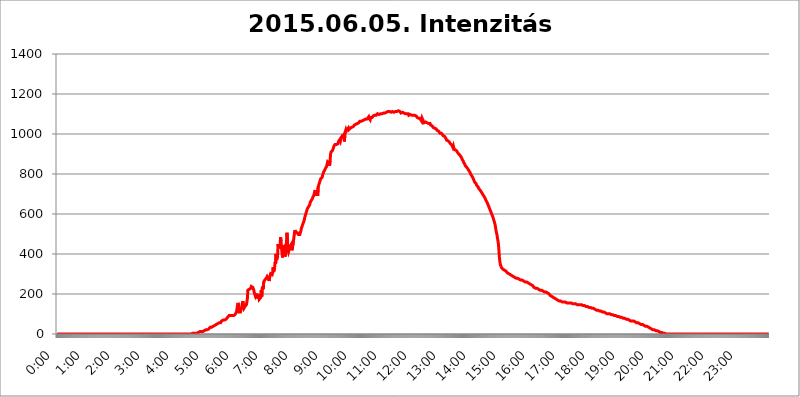
| Category | 2015.06.05. Intenzitás [W/m^2] |
|---|---|
| 0.0 | 0 |
| 0.0006944444444444445 | 0 |
| 0.001388888888888889 | 0 |
| 0.0020833333333333333 | 0 |
| 0.002777777777777778 | 0 |
| 0.003472222222222222 | 0 |
| 0.004166666666666667 | 0 |
| 0.004861111111111111 | 0 |
| 0.005555555555555556 | 0 |
| 0.0062499999999999995 | 0 |
| 0.006944444444444444 | 0 |
| 0.007638888888888889 | 0 |
| 0.008333333333333333 | 0 |
| 0.009027777777777779 | 0 |
| 0.009722222222222222 | 0 |
| 0.010416666666666666 | 0 |
| 0.011111111111111112 | 0 |
| 0.011805555555555555 | 0 |
| 0.012499999999999999 | 0 |
| 0.013194444444444444 | 0 |
| 0.013888888888888888 | 0 |
| 0.014583333333333332 | 0 |
| 0.015277777777777777 | 0 |
| 0.015972222222222224 | 0 |
| 0.016666666666666666 | 0 |
| 0.017361111111111112 | 0 |
| 0.018055555555555557 | 0 |
| 0.01875 | 0 |
| 0.019444444444444445 | 0 |
| 0.02013888888888889 | 0 |
| 0.020833333333333332 | 0 |
| 0.02152777777777778 | 0 |
| 0.022222222222222223 | 0 |
| 0.02291666666666667 | 0 |
| 0.02361111111111111 | 0 |
| 0.024305555555555556 | 0 |
| 0.024999999999999998 | 0 |
| 0.025694444444444447 | 0 |
| 0.02638888888888889 | 0 |
| 0.027083333333333334 | 0 |
| 0.027777777777777776 | 0 |
| 0.02847222222222222 | 0 |
| 0.029166666666666664 | 0 |
| 0.029861111111111113 | 0 |
| 0.030555555555555555 | 0 |
| 0.03125 | 0 |
| 0.03194444444444445 | 0 |
| 0.03263888888888889 | 0 |
| 0.03333333333333333 | 0 |
| 0.034027777777777775 | 0 |
| 0.034722222222222224 | 0 |
| 0.035416666666666666 | 0 |
| 0.036111111111111115 | 0 |
| 0.03680555555555556 | 0 |
| 0.0375 | 0 |
| 0.03819444444444444 | 0 |
| 0.03888888888888889 | 0 |
| 0.03958333333333333 | 0 |
| 0.04027777777777778 | 0 |
| 0.04097222222222222 | 0 |
| 0.041666666666666664 | 0 |
| 0.042361111111111106 | 0 |
| 0.04305555555555556 | 0 |
| 0.043750000000000004 | 0 |
| 0.044444444444444446 | 0 |
| 0.04513888888888889 | 0 |
| 0.04583333333333334 | 0 |
| 0.04652777777777778 | 0 |
| 0.04722222222222222 | 0 |
| 0.04791666666666666 | 0 |
| 0.04861111111111111 | 0 |
| 0.049305555555555554 | 0 |
| 0.049999999999999996 | 0 |
| 0.05069444444444445 | 0 |
| 0.051388888888888894 | 0 |
| 0.052083333333333336 | 0 |
| 0.05277777777777778 | 0 |
| 0.05347222222222222 | 0 |
| 0.05416666666666667 | 0 |
| 0.05486111111111111 | 0 |
| 0.05555555555555555 | 0 |
| 0.05625 | 0 |
| 0.05694444444444444 | 0 |
| 0.057638888888888885 | 0 |
| 0.05833333333333333 | 0 |
| 0.05902777777777778 | 0 |
| 0.059722222222222225 | 0 |
| 0.06041666666666667 | 0 |
| 0.061111111111111116 | 0 |
| 0.06180555555555556 | 0 |
| 0.0625 | 0 |
| 0.06319444444444444 | 0 |
| 0.06388888888888888 | 0 |
| 0.06458333333333334 | 0 |
| 0.06527777777777778 | 0 |
| 0.06597222222222222 | 0 |
| 0.06666666666666667 | 0 |
| 0.06736111111111111 | 0 |
| 0.06805555555555555 | 0 |
| 0.06874999999999999 | 0 |
| 0.06944444444444443 | 0 |
| 0.07013888888888889 | 0 |
| 0.07083333333333333 | 0 |
| 0.07152777777777779 | 0 |
| 0.07222222222222223 | 0 |
| 0.07291666666666667 | 0 |
| 0.07361111111111111 | 0 |
| 0.07430555555555556 | 0 |
| 0.075 | 0 |
| 0.07569444444444444 | 0 |
| 0.0763888888888889 | 0 |
| 0.07708333333333334 | 0 |
| 0.07777777777777778 | 0 |
| 0.07847222222222222 | 0 |
| 0.07916666666666666 | 0 |
| 0.0798611111111111 | 0 |
| 0.08055555555555556 | 0 |
| 0.08125 | 0 |
| 0.08194444444444444 | 0 |
| 0.08263888888888889 | 0 |
| 0.08333333333333333 | 0 |
| 0.08402777777777777 | 0 |
| 0.08472222222222221 | 0 |
| 0.08541666666666665 | 0 |
| 0.08611111111111112 | 0 |
| 0.08680555555555557 | 0 |
| 0.08750000000000001 | 0 |
| 0.08819444444444445 | 0 |
| 0.08888888888888889 | 0 |
| 0.08958333333333333 | 0 |
| 0.09027777777777778 | 0 |
| 0.09097222222222222 | 0 |
| 0.09166666666666667 | 0 |
| 0.09236111111111112 | 0 |
| 0.09305555555555556 | 0 |
| 0.09375 | 0 |
| 0.09444444444444444 | 0 |
| 0.09513888888888888 | 0 |
| 0.09583333333333333 | 0 |
| 0.09652777777777777 | 0 |
| 0.09722222222222222 | 0 |
| 0.09791666666666667 | 0 |
| 0.09861111111111111 | 0 |
| 0.09930555555555555 | 0 |
| 0.09999999999999999 | 0 |
| 0.10069444444444443 | 0 |
| 0.1013888888888889 | 0 |
| 0.10208333333333335 | 0 |
| 0.10277777777777779 | 0 |
| 0.10347222222222223 | 0 |
| 0.10416666666666667 | 0 |
| 0.10486111111111111 | 0 |
| 0.10555555555555556 | 0 |
| 0.10625 | 0 |
| 0.10694444444444444 | 0 |
| 0.1076388888888889 | 0 |
| 0.10833333333333334 | 0 |
| 0.10902777777777778 | 0 |
| 0.10972222222222222 | 0 |
| 0.1111111111111111 | 0 |
| 0.11180555555555556 | 0 |
| 0.11180555555555556 | 0 |
| 0.1125 | 0 |
| 0.11319444444444444 | 0 |
| 0.11388888888888889 | 0 |
| 0.11458333333333333 | 0 |
| 0.11527777777777777 | 0 |
| 0.11597222222222221 | 0 |
| 0.11666666666666665 | 0 |
| 0.1173611111111111 | 0 |
| 0.11805555555555557 | 0 |
| 0.11944444444444445 | 0 |
| 0.12013888888888889 | 0 |
| 0.12083333333333333 | 0 |
| 0.12152777777777778 | 0 |
| 0.12222222222222223 | 0 |
| 0.12291666666666667 | 0 |
| 0.12291666666666667 | 0 |
| 0.12361111111111112 | 0 |
| 0.12430555555555556 | 0 |
| 0.125 | 0 |
| 0.12569444444444444 | 0 |
| 0.12638888888888888 | 0 |
| 0.12708333333333333 | 0 |
| 0.16875 | 0 |
| 0.12847222222222224 | 0 |
| 0.12916666666666668 | 0 |
| 0.12986111111111112 | 0 |
| 0.13055555555555556 | 0 |
| 0.13125 | 0 |
| 0.13194444444444445 | 0 |
| 0.1326388888888889 | 0 |
| 0.13333333333333333 | 0 |
| 0.13402777777777777 | 0 |
| 0.13402777777777777 | 0 |
| 0.13472222222222222 | 0 |
| 0.13541666666666666 | 0 |
| 0.1361111111111111 | 0 |
| 0.13749999999999998 | 0 |
| 0.13819444444444443 | 0 |
| 0.1388888888888889 | 0 |
| 0.13958333333333334 | 0 |
| 0.14027777777777778 | 0 |
| 0.14097222222222222 | 0 |
| 0.14166666666666666 | 0 |
| 0.1423611111111111 | 0 |
| 0.14305555555555557 | 0 |
| 0.14375000000000002 | 0 |
| 0.14444444444444446 | 0 |
| 0.1451388888888889 | 0 |
| 0.1451388888888889 | 0 |
| 0.14652777777777778 | 0 |
| 0.14722222222222223 | 0 |
| 0.14791666666666667 | 0 |
| 0.1486111111111111 | 0 |
| 0.14930555555555555 | 0 |
| 0.15 | 0 |
| 0.15069444444444444 | 0 |
| 0.15138888888888888 | 0 |
| 0.15208333333333332 | 0 |
| 0.15277777777777776 | 0 |
| 0.15347222222222223 | 0 |
| 0.15416666666666667 | 0 |
| 0.15486111111111112 | 0 |
| 0.15555555555555556 | 0 |
| 0.15625 | 0 |
| 0.15694444444444444 | 0 |
| 0.15763888888888888 | 0 |
| 0.15833333333333333 | 0 |
| 0.15902777777777777 | 0 |
| 0.15972222222222224 | 0 |
| 0.16041666666666668 | 0 |
| 0.16111111111111112 | 0 |
| 0.16180555555555556 | 0 |
| 0.1625 | 0 |
| 0.16319444444444445 | 0 |
| 0.1638888888888889 | 0 |
| 0.16458333333333333 | 0 |
| 0.16527777777777777 | 0 |
| 0.16597222222222222 | 0 |
| 0.16666666666666666 | 0 |
| 0.1673611111111111 | 0 |
| 0.16805555555555554 | 0 |
| 0.16874999999999998 | 0 |
| 0.16944444444444443 | 0 |
| 0.17013888888888887 | 0 |
| 0.1708333333333333 | 0 |
| 0.17152777777777775 | 0 |
| 0.17222222222222225 | 0 |
| 0.1729166666666667 | 0 |
| 0.17361111111111113 | 0 |
| 0.17430555555555557 | 0 |
| 0.17500000000000002 | 0 |
| 0.17569444444444446 | 0 |
| 0.1763888888888889 | 0 |
| 0.17708333333333334 | 0 |
| 0.17777777777777778 | 0 |
| 0.17847222222222223 | 0 |
| 0.17916666666666667 | 0 |
| 0.1798611111111111 | 0 |
| 0.18055555555555555 | 0 |
| 0.18125 | 0 |
| 0.18194444444444444 | 0 |
| 0.1826388888888889 | 0 |
| 0.18333333333333335 | 0 |
| 0.1840277777777778 | 0 |
| 0.18472222222222223 | 0 |
| 0.18541666666666667 | 0 |
| 0.18611111111111112 | 0 |
| 0.18680555555555556 | 0 |
| 0.1875 | 0 |
| 0.18819444444444444 | 0 |
| 0.18888888888888888 | 3.525 |
| 0.18958333333333333 | 3.525 |
| 0.19027777777777777 | 3.525 |
| 0.1909722222222222 | 3.525 |
| 0.19166666666666665 | 3.525 |
| 0.19236111111111112 | 3.525 |
| 0.19305555555555554 | 3.525 |
| 0.19375 | 3.525 |
| 0.19444444444444445 | 3.525 |
| 0.1951388888888889 | 3.525 |
| 0.19583333333333333 | 3.525 |
| 0.19652777777777777 | 7.887 |
| 0.19722222222222222 | 7.887 |
| 0.19791666666666666 | 7.887 |
| 0.1986111111111111 | 7.887 |
| 0.19930555555555554 | 7.887 |
| 0.19999999999999998 | 12.257 |
| 0.20069444444444443 | 12.257 |
| 0.20138888888888887 | 12.257 |
| 0.2020833333333333 | 12.257 |
| 0.2027777777777778 | 12.257 |
| 0.2034722222222222 | 12.257 |
| 0.2041666666666667 | 12.257 |
| 0.20486111111111113 | 16.636 |
| 0.20555555555555557 | 16.636 |
| 0.20625000000000002 | 16.636 |
| 0.20694444444444446 | 16.636 |
| 0.2076388888888889 | 21.024 |
| 0.20833333333333334 | 21.024 |
| 0.20902777777777778 | 21.024 |
| 0.20972222222222223 | 21.024 |
| 0.21041666666666667 | 21.024 |
| 0.2111111111111111 | 25.419 |
| 0.21180555555555555 | 25.419 |
| 0.2125 | 25.419 |
| 0.21319444444444444 | 29.823 |
| 0.2138888888888889 | 29.823 |
| 0.21458333333333335 | 34.234 |
| 0.2152777777777778 | 34.234 |
| 0.21597222222222223 | 34.234 |
| 0.21666666666666667 | 34.234 |
| 0.21736111111111112 | 34.234 |
| 0.21805555555555556 | 38.653 |
| 0.21875 | 38.653 |
| 0.21944444444444444 | 38.653 |
| 0.22013888888888888 | 43.079 |
| 0.22083333333333333 | 43.079 |
| 0.22152777777777777 | 43.079 |
| 0.2222222222222222 | 47.511 |
| 0.22291666666666665 | 47.511 |
| 0.2236111111111111 | 47.511 |
| 0.22430555555555556 | 47.511 |
| 0.225 | 51.951 |
| 0.22569444444444445 | 51.951 |
| 0.2263888888888889 | 51.951 |
| 0.22708333333333333 | 56.398 |
| 0.22777777777777777 | 56.398 |
| 0.22847222222222222 | 56.398 |
| 0.22916666666666666 | 56.398 |
| 0.2298611111111111 | 60.85 |
| 0.23055555555555554 | 65.31 |
| 0.23124999999999998 | 65.31 |
| 0.23194444444444443 | 65.31 |
| 0.23263888888888887 | 69.775 |
| 0.2333333333333333 | 69.775 |
| 0.2340277777777778 | 69.775 |
| 0.2347222222222222 | 69.775 |
| 0.2354166666666667 | 69.775 |
| 0.23611111111111113 | 69.775 |
| 0.23680555555555557 | 74.246 |
| 0.23750000000000002 | 74.246 |
| 0.23819444444444446 | 78.722 |
| 0.2388888888888889 | 83.205 |
| 0.23958333333333334 | 83.205 |
| 0.24027777777777778 | 87.692 |
| 0.24097222222222223 | 92.184 |
| 0.24166666666666667 | 92.184 |
| 0.2423611111111111 | 92.184 |
| 0.24305555555555555 | 92.184 |
| 0.24375 | 92.184 |
| 0.24444444444444446 | 92.184 |
| 0.24513888888888888 | 92.184 |
| 0.24583333333333335 | 92.184 |
| 0.2465277777777778 | 92.184 |
| 0.24722222222222223 | 92.184 |
| 0.24791666666666667 | 92.184 |
| 0.24861111111111112 | 96.682 |
| 0.24930555555555556 | 96.682 |
| 0.25 | 101.184 |
| 0.25069444444444444 | 101.184 |
| 0.2513888888888889 | 110.201 |
| 0.2520833333333333 | 114.716 |
| 0.25277777777777777 | 141.884 |
| 0.2534722222222222 | 155.509 |
| 0.25416666666666665 | 146.423 |
| 0.2548611111111111 | 110.201 |
| 0.2555555555555556 | 110.201 |
| 0.25625000000000003 | 110.201 |
| 0.2569444444444445 | 110.201 |
| 0.2576388888888889 | 119.235 |
| 0.25833333333333336 | 128.284 |
| 0.2590277777777778 | 141.884 |
| 0.25972222222222224 | 155.509 |
| 0.2604166666666667 | 164.605 |
| 0.2611111111111111 | 137.347 |
| 0.26180555555555557 | 128.284 |
| 0.2625 | 132.814 |
| 0.26319444444444445 | 137.347 |
| 0.2638888888888889 | 137.347 |
| 0.26458333333333334 | 141.884 |
| 0.2652777777777778 | 146.423 |
| 0.2659722222222222 | 160.056 |
| 0.26666666666666666 | 178.264 |
| 0.2673611111111111 | 219.309 |
| 0.26805555555555555 | 223.873 |
| 0.26875 | 223.873 |
| 0.26944444444444443 | 223.873 |
| 0.2701388888888889 | 223.873 |
| 0.2708333333333333 | 228.436 |
| 0.27152777777777776 | 228.436 |
| 0.2722222222222222 | 237.564 |
| 0.27291666666666664 | 233 |
| 0.2736111111111111 | 233 |
| 0.2743055555555555 | 233 |
| 0.27499999999999997 | 233 |
| 0.27569444444444446 | 219.309 |
| 0.27638888888888885 | 205.62 |
| 0.27708333333333335 | 210.182 |
| 0.2777777777777778 | 191.937 |
| 0.27847222222222223 | 201.058 |
| 0.2791666666666667 | 178.264 |
| 0.2798611111111111 | 182.82 |
| 0.28055555555555556 | 173.709 |
| 0.28125 | 201.058 |
| 0.28194444444444444 | 182.82 |
| 0.2826388888888889 | 196.497 |
| 0.2833333333333333 | 173.709 |
| 0.28402777777777777 | 173.709 |
| 0.2847222222222222 | 178.264 |
| 0.28541666666666665 | 182.82 |
| 0.28611111111111115 | 219.309 |
| 0.28680555555555554 | 187.378 |
| 0.28750000000000003 | 228.436 |
| 0.2881944444444445 | 237.564 |
| 0.2888888888888889 | 223.873 |
| 0.28958333333333336 | 260.373 |
| 0.2902777777777778 | 264.932 |
| 0.29097222222222224 | 269.49 |
| 0.2916666666666667 | 274.047 |
| 0.2923611111111111 | 274.047 |
| 0.29305555555555557 | 278.603 |
| 0.29375 | 283.156 |
| 0.29444444444444445 | 287.709 |
| 0.2951388888888889 | 287.709 |
| 0.29583333333333334 | 292.259 |
| 0.2965277777777778 | 274.047 |
| 0.2972222222222222 | 264.932 |
| 0.29791666666666666 | 283.156 |
| 0.2986111111111111 | 287.709 |
| 0.29930555555555555 | 301.354 |
| 0.3 | 301.354 |
| 0.30069444444444443 | 296.808 |
| 0.3013888888888889 | 296.808 |
| 0.3020833333333333 | 305.898 |
| 0.30277777777777776 | 333.113 |
| 0.3034722222222222 | 310.44 |
| 0.30416666666666664 | 305.898 |
| 0.3048611111111111 | 333.113 |
| 0.3055555555555555 | 360.221 |
| 0.30624999999999997 | 351.198 |
| 0.3069444444444444 | 400.638 |
| 0.3076388888888889 | 369.23 |
| 0.30833333333333335 | 369.23 |
| 0.3090277777777778 | 391.685 |
| 0.30972222222222223 | 449.551 |
| 0.3104166666666667 | 431.833 |
| 0.3111111111111111 | 431.833 |
| 0.31180555555555556 | 436.27 |
| 0.3125 | 440.702 |
| 0.31319444444444444 | 484.735 |
| 0.3138888888888889 | 462.786 |
| 0.3145833333333333 | 427.39 |
| 0.31527777777777777 | 405.108 |
| 0.3159722222222222 | 382.715 |
| 0.31666666666666665 | 405.108 |
| 0.31736111111111115 | 445.129 |
| 0.31805555555555554 | 440.702 |
| 0.31875000000000003 | 431.833 |
| 0.3194444444444445 | 387.202 |
| 0.3201388888888889 | 382.715 |
| 0.32083333333333336 | 387.202 |
| 0.3215277777777778 | 458.38 |
| 0.32222222222222224 | 506.542 |
| 0.3229166666666667 | 462.786 |
| 0.3236111111111111 | 418.492 |
| 0.32430555555555557 | 409.574 |
| 0.325 | 409.574 |
| 0.32569444444444445 | 414.035 |
| 0.3263888888888889 | 436.27 |
| 0.32708333333333334 | 436.27 |
| 0.3277777777777778 | 431.833 |
| 0.3284722222222222 | 449.551 |
| 0.32916666666666666 | 418.492 |
| 0.3298611111111111 | 414.035 |
| 0.33055555555555555 | 422.943 |
| 0.33125 | 462.786 |
| 0.33194444444444443 | 458.38 |
| 0.3326388888888889 | 502.192 |
| 0.3333333333333333 | 519.555 |
| 0.3340277777777778 | 519.555 |
| 0.3347222222222222 | 506.542 |
| 0.3354166666666667 | 510.885 |
| 0.3361111111111111 | 506.542 |
| 0.3368055555555556 | 506.542 |
| 0.33749999999999997 | 506.542 |
| 0.33819444444444446 | 497.836 |
| 0.33888888888888885 | 497.836 |
| 0.33958333333333335 | 497.836 |
| 0.34027777777777773 | 497.836 |
| 0.34097222222222223 | 506.542 |
| 0.3416666666666666 | 515.223 |
| 0.3423611111111111 | 528.2 |
| 0.3430555555555555 | 532.513 |
| 0.34375 | 541.121 |
| 0.3444444444444445 | 549.704 |
| 0.3451388888888889 | 553.986 |
| 0.3458333333333334 | 562.53 |
| 0.34652777777777777 | 571.049 |
| 0.34722222222222227 | 583.779 |
| 0.34791666666666665 | 592.233 |
| 0.34861111111111115 | 600.661 |
| 0.34930555555555554 | 609.062 |
| 0.35000000000000003 | 617.436 |
| 0.3506944444444444 | 625.784 |
| 0.3513888888888889 | 629.948 |
| 0.3520833333333333 | 634.105 |
| 0.3527777777777778 | 638.256 |
| 0.3534722222222222 | 638.256 |
| 0.3541666666666667 | 646.537 |
| 0.3548611111111111 | 658.909 |
| 0.35555555555555557 | 663.019 |
| 0.35625 | 667.123 |
| 0.35694444444444445 | 667.123 |
| 0.3576388888888889 | 675.311 |
| 0.35833333333333334 | 683.473 |
| 0.3590277777777778 | 687.544 |
| 0.3597222222222222 | 691.608 |
| 0.36041666666666666 | 695.666 |
| 0.3611111111111111 | 711.832 |
| 0.36180555555555555 | 719.877 |
| 0.3625 | 699.717 |
| 0.36319444444444443 | 691.608 |
| 0.3638888888888889 | 715.858 |
| 0.3645833333333333 | 715.858 |
| 0.3652777777777778 | 691.608 |
| 0.3659722222222222 | 735.89 |
| 0.3666666666666667 | 743.859 |
| 0.3673611111111111 | 751.803 |
| 0.3680555555555556 | 759.723 |
| 0.36874999999999997 | 763.674 |
| 0.36944444444444446 | 775.492 |
| 0.37013888888888885 | 775.492 |
| 0.37083333333333335 | 775.492 |
| 0.37152777777777773 | 783.342 |
| 0.37222222222222223 | 795.074 |
| 0.3729166666666666 | 802.868 |
| 0.3736111111111111 | 810.641 |
| 0.3743055555555555 | 814.519 |
| 0.375 | 818.392 |
| 0.3756944444444445 | 822.26 |
| 0.3763888888888889 | 829.981 |
| 0.3770833333333334 | 833.834 |
| 0.37777777777777777 | 837.682 |
| 0.37847222222222227 | 849.199 |
| 0.37916666666666665 | 860.676 |
| 0.37986111111111115 | 860.676 |
| 0.38055555555555554 | 864.493 |
| 0.38125000000000003 | 853.029 |
| 0.3819444444444444 | 841.526 |
| 0.3826388888888889 | 868.305 |
| 0.3833333333333333 | 898.668 |
| 0.3840277777777778 | 909.996 |
| 0.3847222222222222 | 909.996 |
| 0.3854166666666667 | 913.766 |
| 0.3861111111111111 | 917.534 |
| 0.38680555555555557 | 925.06 |
| 0.3875 | 932.576 |
| 0.38819444444444445 | 940.082 |
| 0.3888888888888889 | 940.082 |
| 0.38958333333333334 | 947.58 |
| 0.3902777777777778 | 943.832 |
| 0.3909722222222222 | 947.58 |
| 0.39166666666666666 | 947.58 |
| 0.3923611111111111 | 951.327 |
| 0.39305555555555555 | 951.327 |
| 0.39375 | 951.327 |
| 0.39444444444444443 | 962.555 |
| 0.3951388888888889 | 966.295 |
| 0.3958333333333333 | 962.555 |
| 0.3965277777777778 | 973.772 |
| 0.3972222222222222 | 966.295 |
| 0.3979166666666667 | 977.508 |
| 0.3986111111111111 | 977.508 |
| 0.3993055555555556 | 977.508 |
| 0.39999999999999997 | 992.448 |
| 0.40069444444444446 | 992.448 |
| 0.40138888888888885 | 996.182 |
| 0.40208333333333335 | 996.182 |
| 0.40277777777777773 | 962.555 |
| 0.40347222222222223 | 1007.383 |
| 0.4041666666666666 | 1014.852 |
| 0.4048611111111111 | 1022.323 |
| 0.4055555555555555 | 1014.852 |
| 0.40625 | 1018.587 |
| 0.4069444444444445 | 1022.323 |
| 0.4076388888888889 | 1022.323 |
| 0.4083333333333334 | 1029.798 |
| 0.40902777777777777 | 1022.323 |
| 0.40972222222222227 | 1026.06 |
| 0.41041666666666665 | 1026.06 |
| 0.41111111111111115 | 1029.798 |
| 0.41180555555555554 | 1029.798 |
| 0.41250000000000003 | 1029.798 |
| 0.4131944444444444 | 1033.537 |
| 0.4138888888888889 | 1033.537 |
| 0.4145833333333333 | 1037.277 |
| 0.4152777777777778 | 1037.277 |
| 0.4159722222222222 | 1037.277 |
| 0.4166666666666667 | 1044.762 |
| 0.4173611111111111 | 1048.508 |
| 0.41805555555555557 | 1044.762 |
| 0.41875 | 1048.508 |
| 0.41944444444444445 | 1048.508 |
| 0.4201388888888889 | 1048.508 |
| 0.42083333333333334 | 1052.255 |
| 0.4215277777777778 | 1056.004 |
| 0.4222222222222222 | 1052.255 |
| 0.42291666666666666 | 1056.004 |
| 0.4236111111111111 | 1059.756 |
| 0.42430555555555555 | 1063.51 |
| 0.425 | 1059.756 |
| 0.42569444444444443 | 1067.267 |
| 0.4263888888888889 | 1063.51 |
| 0.4270833333333333 | 1067.267 |
| 0.4277777777777778 | 1067.267 |
| 0.4284722222222222 | 1067.267 |
| 0.4291666666666667 | 1063.51 |
| 0.4298611111111111 | 1067.267 |
| 0.4305555555555556 | 1071.027 |
| 0.43124999999999997 | 1071.027 |
| 0.43194444444444446 | 1071.027 |
| 0.43263888888888885 | 1074.789 |
| 0.43333333333333335 | 1074.789 |
| 0.43402777777777773 | 1074.789 |
| 0.43472222222222223 | 1074.789 |
| 0.4354166666666666 | 1078.555 |
| 0.4361111111111111 | 1078.555 |
| 0.4368055555555555 | 1086.097 |
| 0.4375 | 1078.555 |
| 0.4381944444444445 | 1074.789 |
| 0.4388888888888889 | 1071.027 |
| 0.4395833333333334 | 1082.324 |
| 0.44027777777777777 | 1082.324 |
| 0.44097222222222227 | 1082.324 |
| 0.44166666666666665 | 1082.324 |
| 0.44236111111111115 | 1086.097 |
| 0.44305555555555554 | 1089.873 |
| 0.44375000000000003 | 1089.873 |
| 0.4444444444444444 | 1089.873 |
| 0.4451388888888889 | 1093.653 |
| 0.4458333333333333 | 1097.437 |
| 0.4465277777777778 | 1093.653 |
| 0.4472222222222222 | 1093.653 |
| 0.4479166666666667 | 1097.437 |
| 0.4486111111111111 | 1097.437 |
| 0.44930555555555557 | 1101.226 |
| 0.45 | 1101.226 |
| 0.45069444444444445 | 1101.226 |
| 0.4513888888888889 | 1097.437 |
| 0.45208333333333334 | 1101.226 |
| 0.4527777777777778 | 1101.226 |
| 0.4534722222222222 | 1101.226 |
| 0.45416666666666666 | 1101.226 |
| 0.4548611111111111 | 1101.226 |
| 0.45555555555555555 | 1101.226 |
| 0.45625 | 1101.226 |
| 0.45694444444444443 | 1101.226 |
| 0.4576388888888889 | 1105.019 |
| 0.4583333333333333 | 1105.019 |
| 0.4590277777777778 | 1105.019 |
| 0.4597222222222222 | 1105.019 |
| 0.4604166666666667 | 1108.816 |
| 0.4611111111111111 | 1108.816 |
| 0.4618055555555556 | 1108.816 |
| 0.46249999999999997 | 1108.816 |
| 0.46319444444444446 | 1108.816 |
| 0.46388888888888885 | 1112.618 |
| 0.46458333333333335 | 1108.816 |
| 0.46527777777777773 | 1108.816 |
| 0.46597222222222223 | 1112.618 |
| 0.4666666666666666 | 1112.618 |
| 0.4673611111111111 | 1112.618 |
| 0.4680555555555555 | 1108.816 |
| 0.46875 | 1108.816 |
| 0.4694444444444445 | 1112.618 |
| 0.4701388888888889 | 1112.618 |
| 0.4708333333333334 | 1112.618 |
| 0.47152777777777777 | 1108.816 |
| 0.47222222222222227 | 1108.816 |
| 0.47291666666666665 | 1108.816 |
| 0.47361111111111115 | 1108.816 |
| 0.47430555555555554 | 1112.618 |
| 0.47500000000000003 | 1112.618 |
| 0.4756944444444444 | 1112.618 |
| 0.4763888888888889 | 1112.618 |
| 0.4770833333333333 | 1116.426 |
| 0.4777777777777778 | 1116.426 |
| 0.4784722222222222 | 1116.426 |
| 0.4791666666666667 | 1112.618 |
| 0.4798611111111111 | 1112.618 |
| 0.48055555555555557 | 1112.618 |
| 0.48125 | 1108.816 |
| 0.48194444444444445 | 1105.019 |
| 0.4826388888888889 | 1108.816 |
| 0.48333333333333334 | 1105.019 |
| 0.4840277777777778 | 1108.816 |
| 0.4847222222222222 | 1105.019 |
| 0.48541666666666666 | 1105.019 |
| 0.4861111111111111 | 1105.019 |
| 0.48680555555555555 | 1105.019 |
| 0.4875 | 1105.019 |
| 0.48819444444444443 | 1101.226 |
| 0.4888888888888889 | 1101.226 |
| 0.4895833333333333 | 1105.019 |
| 0.4902777777777778 | 1101.226 |
| 0.4909722222222222 | 1101.226 |
| 0.4916666666666667 | 1101.226 |
| 0.4923611111111111 | 1101.226 |
| 0.4930555555555556 | 1093.653 |
| 0.49374999999999997 | 1093.653 |
| 0.49444444444444446 | 1097.437 |
| 0.49513888888888885 | 1097.437 |
| 0.49583333333333335 | 1097.437 |
| 0.49652777777777773 | 1097.437 |
| 0.49722222222222223 | 1093.653 |
| 0.4979166666666666 | 1089.873 |
| 0.4986111111111111 | 1093.653 |
| 0.4993055555555555 | 1093.653 |
| 0.5 | 1089.873 |
| 0.5006944444444444 | 1093.653 |
| 0.5013888888888889 | 1093.653 |
| 0.5020833333333333 | 1089.873 |
| 0.5027777777777778 | 1093.653 |
| 0.5034722222222222 | 1089.873 |
| 0.5041666666666667 | 1086.097 |
| 0.5048611111111111 | 1082.324 |
| 0.5055555555555555 | 1078.555 |
| 0.50625 | 1078.555 |
| 0.5069444444444444 | 1078.555 |
| 0.5076388888888889 | 1078.555 |
| 0.5083333333333333 | 1078.555 |
| 0.5090277777777777 | 1078.555 |
| 0.5097222222222222 | 1071.027 |
| 0.5104166666666666 | 1071.027 |
| 0.5111111111111112 | 1063.51 |
| 0.5118055555555555 | 1078.555 |
| 0.5125000000000001 | 1074.789 |
| 0.5131944444444444 | 1067.267 |
| 0.513888888888889 | 1063.51 |
| 0.5145833333333333 | 1056.004 |
| 0.5152777777777778 | 1056.004 |
| 0.5159722222222222 | 1056.004 |
| 0.5166666666666667 | 1059.756 |
| 0.517361111111111 | 1059.756 |
| 0.5180555555555556 | 1059.756 |
| 0.5187499999999999 | 1056.004 |
| 0.5194444444444445 | 1052.255 |
| 0.5201388888888888 | 1052.255 |
| 0.5208333333333334 | 1052.255 |
| 0.5215277777777778 | 1052.255 |
| 0.5222222222222223 | 1048.508 |
| 0.5229166666666667 | 1052.255 |
| 0.5236111111111111 | 1044.762 |
| 0.5243055555555556 | 1044.762 |
| 0.525 | 1041.019 |
| 0.5256944444444445 | 1041.019 |
| 0.5263888888888889 | 1037.277 |
| 0.5270833333333333 | 1033.537 |
| 0.5277777777777778 | 1033.537 |
| 0.5284722222222222 | 1029.798 |
| 0.5291666666666667 | 1029.798 |
| 0.5298611111111111 | 1033.537 |
| 0.5305555555555556 | 1026.06 |
| 0.53125 | 1026.06 |
| 0.5319444444444444 | 1022.323 |
| 0.5326388888888889 | 1018.587 |
| 0.5333333333333333 | 1022.323 |
| 0.5340277777777778 | 1018.587 |
| 0.5347222222222222 | 1014.852 |
| 0.5354166666666667 | 1014.852 |
| 0.5361111111111111 | 1011.118 |
| 0.5368055555555555 | 1003.65 |
| 0.5375 | 1003.65 |
| 0.5381944444444444 | 1003.65 |
| 0.5388888888888889 | 1003.65 |
| 0.5395833333333333 | 999.916 |
| 0.5402777777777777 | 999.916 |
| 0.5409722222222222 | 992.448 |
| 0.5416666666666666 | 992.448 |
| 0.5423611111111112 | 988.714 |
| 0.5430555555555555 | 988.714 |
| 0.5437500000000001 | 984.98 |
| 0.5444444444444444 | 984.98 |
| 0.545138888888889 | 977.508 |
| 0.5458333333333333 | 970.034 |
| 0.5465277777777778 | 970.034 |
| 0.5472222222222222 | 970.034 |
| 0.5479166666666667 | 966.295 |
| 0.548611111111111 | 966.295 |
| 0.5493055555555556 | 966.295 |
| 0.5499999999999999 | 958.814 |
| 0.5506944444444445 | 955.071 |
| 0.5513888888888888 | 951.327 |
| 0.5520833333333334 | 955.071 |
| 0.5527777777777778 | 947.58 |
| 0.5534722222222223 | 943.832 |
| 0.5541666666666667 | 940.082 |
| 0.5548611111111111 | 932.576 |
| 0.5555555555555556 | 940.082 |
| 0.55625 | 928.819 |
| 0.5569444444444445 | 925.06 |
| 0.5576388888888889 | 921.298 |
| 0.5583333333333333 | 917.534 |
| 0.5590277777777778 | 917.534 |
| 0.5597222222222222 | 917.534 |
| 0.5604166666666667 | 917.534 |
| 0.5611111111111111 | 909.996 |
| 0.5618055555555556 | 906.223 |
| 0.5625 | 902.447 |
| 0.5631944444444444 | 902.447 |
| 0.5638888888888889 | 898.668 |
| 0.5645833333333333 | 894.885 |
| 0.5652777777777778 | 891.099 |
| 0.5659722222222222 | 887.309 |
| 0.5666666666666667 | 883.516 |
| 0.5673611111111111 | 879.719 |
| 0.5680555555555555 | 872.114 |
| 0.56875 | 868.305 |
| 0.5694444444444444 | 864.493 |
| 0.5701388888888889 | 856.855 |
| 0.5708333333333333 | 853.029 |
| 0.5715277777777777 | 849.199 |
| 0.5722222222222222 | 841.526 |
| 0.5729166666666666 | 845.365 |
| 0.5736111111111112 | 837.682 |
| 0.5743055555555555 | 833.834 |
| 0.5750000000000001 | 833.834 |
| 0.5756944444444444 | 829.981 |
| 0.576388888888889 | 822.26 |
| 0.5770833333333333 | 822.26 |
| 0.5777777777777778 | 814.519 |
| 0.5784722222222222 | 810.641 |
| 0.5791666666666667 | 806.757 |
| 0.579861111111111 | 798.974 |
| 0.5805555555555556 | 795.074 |
| 0.5812499999999999 | 791.169 |
| 0.5819444444444445 | 787.258 |
| 0.5826388888888888 | 783.342 |
| 0.5833333333333334 | 779.42 |
| 0.5840277777777778 | 771.559 |
| 0.5847222222222223 | 767.62 |
| 0.5854166666666667 | 759.723 |
| 0.5861111111111111 | 755.766 |
| 0.5868055555555556 | 755.766 |
| 0.5875 | 751.803 |
| 0.5881944444444445 | 743.859 |
| 0.5888888888888889 | 743.859 |
| 0.5895833333333333 | 739.877 |
| 0.5902777777777778 | 735.89 |
| 0.5909722222222222 | 727.896 |
| 0.5916666666666667 | 723.889 |
| 0.5923611111111111 | 723.889 |
| 0.5930555555555556 | 719.877 |
| 0.59375 | 715.858 |
| 0.5944444444444444 | 711.832 |
| 0.5951388888888889 | 707.8 |
| 0.5958333333333333 | 703.762 |
| 0.5965277777777778 | 699.717 |
| 0.5972222222222222 | 695.666 |
| 0.5979166666666667 | 691.608 |
| 0.5986111111111111 | 687.544 |
| 0.5993055555555555 | 687.544 |
| 0.6 | 679.395 |
| 0.6006944444444444 | 675.311 |
| 0.6013888888888889 | 667.123 |
| 0.6020833333333333 | 663.019 |
| 0.6027777777777777 | 658.909 |
| 0.6034722222222222 | 654.791 |
| 0.6041666666666666 | 646.537 |
| 0.6048611111111112 | 642.4 |
| 0.6055555555555555 | 634.105 |
| 0.6062500000000001 | 629.948 |
| 0.6069444444444444 | 621.613 |
| 0.607638888888889 | 617.436 |
| 0.6083333333333333 | 609.062 |
| 0.6090277777777778 | 604.864 |
| 0.6097222222222222 | 596.45 |
| 0.6104166666666667 | 592.233 |
| 0.611111111111111 | 583.779 |
| 0.6118055555555556 | 575.299 |
| 0.6124999999999999 | 566.793 |
| 0.6131944444444445 | 558.261 |
| 0.6138888888888888 | 549.704 |
| 0.6145833333333334 | 536.82 |
| 0.6152777777777778 | 519.555 |
| 0.6159722222222223 | 506.542 |
| 0.6166666666666667 | 497.836 |
| 0.6173611111111111 | 480.356 |
| 0.6180555555555556 | 467.187 |
| 0.61875 | 449.551 |
| 0.6194444444444445 | 418.492 |
| 0.6201388888888889 | 382.715 |
| 0.6208333333333333 | 360.221 |
| 0.6215277777777778 | 346.682 |
| 0.6222222222222222 | 342.162 |
| 0.6229166666666667 | 333.113 |
| 0.6236111111111111 | 328.584 |
| 0.6243055555555556 | 328.584 |
| 0.625 | 324.052 |
| 0.6256944444444444 | 324.052 |
| 0.6263888888888889 | 319.517 |
| 0.6270833333333333 | 319.517 |
| 0.6277777777777778 | 314.98 |
| 0.6284722222222222 | 314.98 |
| 0.6291666666666667 | 314.98 |
| 0.6298611111111111 | 310.44 |
| 0.6305555555555555 | 310.44 |
| 0.63125 | 305.898 |
| 0.6319444444444444 | 305.898 |
| 0.6326388888888889 | 305.898 |
| 0.6333333333333333 | 301.354 |
| 0.6340277777777777 | 296.808 |
| 0.6347222222222222 | 296.808 |
| 0.6354166666666666 | 296.808 |
| 0.6361111111111112 | 292.259 |
| 0.6368055555555555 | 292.259 |
| 0.6375000000000001 | 292.259 |
| 0.6381944444444444 | 287.709 |
| 0.638888888888889 | 287.709 |
| 0.6395833333333333 | 287.709 |
| 0.6402777777777778 | 287.709 |
| 0.6409722222222222 | 283.156 |
| 0.6416666666666667 | 283.156 |
| 0.642361111111111 | 283.156 |
| 0.6430555555555556 | 278.603 |
| 0.6437499999999999 | 278.603 |
| 0.6444444444444445 | 278.603 |
| 0.6451388888888888 | 278.603 |
| 0.6458333333333334 | 278.603 |
| 0.6465277777777778 | 274.047 |
| 0.6472222222222223 | 274.047 |
| 0.6479166666666667 | 274.047 |
| 0.6486111111111111 | 274.047 |
| 0.6493055555555556 | 274.047 |
| 0.65 | 269.49 |
| 0.6506944444444445 | 269.49 |
| 0.6513888888888889 | 269.49 |
| 0.6520833333333333 | 269.49 |
| 0.6527777777777778 | 269.49 |
| 0.6534722222222222 | 264.932 |
| 0.6541666666666667 | 264.932 |
| 0.6548611111111111 | 264.932 |
| 0.6555555555555556 | 264.932 |
| 0.65625 | 260.373 |
| 0.6569444444444444 | 260.373 |
| 0.6576388888888889 | 260.373 |
| 0.6583333333333333 | 260.373 |
| 0.6590277777777778 | 260.373 |
| 0.6597222222222222 | 255.813 |
| 0.6604166666666667 | 255.813 |
| 0.6611111111111111 | 251.251 |
| 0.6618055555555555 | 251.251 |
| 0.6625 | 251.251 |
| 0.6631944444444444 | 251.251 |
| 0.6638888888888889 | 246.689 |
| 0.6645833333333333 | 246.689 |
| 0.6652777777777777 | 246.689 |
| 0.6659722222222222 | 246.689 |
| 0.6666666666666666 | 242.127 |
| 0.6673611111111111 | 237.564 |
| 0.6680555555555556 | 237.564 |
| 0.6687500000000001 | 233 |
| 0.6694444444444444 | 228.436 |
| 0.6701388888888888 | 228.436 |
| 0.6708333333333334 | 228.436 |
| 0.6715277777777778 | 228.436 |
| 0.6722222222222222 | 228.436 |
| 0.6729166666666666 | 228.436 |
| 0.6736111111111112 | 223.873 |
| 0.6743055555555556 | 223.873 |
| 0.6749999999999999 | 223.873 |
| 0.6756944444444444 | 223.873 |
| 0.6763888888888889 | 223.873 |
| 0.6770833333333334 | 219.309 |
| 0.6777777777777777 | 219.309 |
| 0.6784722222222223 | 219.309 |
| 0.6791666666666667 | 219.309 |
| 0.6798611111111111 | 219.309 |
| 0.6805555555555555 | 219.309 |
| 0.68125 | 214.746 |
| 0.6819444444444445 | 214.746 |
| 0.6826388888888889 | 214.746 |
| 0.6833333333333332 | 210.182 |
| 0.6840277777777778 | 210.182 |
| 0.6847222222222222 | 210.182 |
| 0.6854166666666667 | 210.182 |
| 0.686111111111111 | 210.182 |
| 0.6868055555555556 | 205.62 |
| 0.6875 | 205.62 |
| 0.6881944444444444 | 201.058 |
| 0.688888888888889 | 201.058 |
| 0.6895833333333333 | 201.058 |
| 0.6902777777777778 | 196.497 |
| 0.6909722222222222 | 196.497 |
| 0.6916666666666668 | 191.937 |
| 0.6923611111111111 | 191.937 |
| 0.6930555555555555 | 191.937 |
| 0.69375 | 187.378 |
| 0.6944444444444445 | 187.378 |
| 0.6951388888888889 | 182.82 |
| 0.6958333333333333 | 182.82 |
| 0.6965277777777777 | 182.82 |
| 0.6972222222222223 | 178.264 |
| 0.6979166666666666 | 178.264 |
| 0.6986111111111111 | 178.264 |
| 0.6993055555555556 | 173.709 |
| 0.7000000000000001 | 173.709 |
| 0.7006944444444444 | 173.709 |
| 0.7013888888888888 | 169.156 |
| 0.7020833333333334 | 169.156 |
| 0.7027777777777778 | 169.156 |
| 0.7034722222222222 | 164.605 |
| 0.7041666666666666 | 164.605 |
| 0.7048611111111112 | 164.605 |
| 0.7055555555555556 | 164.605 |
| 0.7062499999999999 | 164.605 |
| 0.7069444444444444 | 160.056 |
| 0.7076388888888889 | 160.056 |
| 0.7083333333333334 | 160.056 |
| 0.7090277777777777 | 160.056 |
| 0.7097222222222223 | 160.056 |
| 0.7104166666666667 | 160.056 |
| 0.7111111111111111 | 160.056 |
| 0.7118055555555555 | 160.056 |
| 0.7125 | 160.056 |
| 0.7131944444444445 | 160.056 |
| 0.7138888888888889 | 160.056 |
| 0.7145833333333332 | 155.509 |
| 0.7152777777777778 | 155.509 |
| 0.7159722222222222 | 155.509 |
| 0.7166666666666667 | 155.509 |
| 0.717361111111111 | 155.509 |
| 0.7180555555555556 | 155.509 |
| 0.71875 | 155.509 |
| 0.7194444444444444 | 155.509 |
| 0.720138888888889 | 155.509 |
| 0.7208333333333333 | 155.509 |
| 0.7215277777777778 | 155.509 |
| 0.7222222222222222 | 155.509 |
| 0.7229166666666668 | 150.964 |
| 0.7236111111111111 | 155.509 |
| 0.7243055555555555 | 150.964 |
| 0.725 | 150.964 |
| 0.7256944444444445 | 150.964 |
| 0.7263888888888889 | 150.964 |
| 0.7270833333333333 | 150.964 |
| 0.7277777777777777 | 150.964 |
| 0.7284722222222223 | 150.964 |
| 0.7291666666666666 | 146.423 |
| 0.7298611111111111 | 146.423 |
| 0.7305555555555556 | 146.423 |
| 0.7312500000000001 | 146.423 |
| 0.7319444444444444 | 146.423 |
| 0.7326388888888888 | 146.423 |
| 0.7333333333333334 | 146.423 |
| 0.7340277777777778 | 146.423 |
| 0.7347222222222222 | 146.423 |
| 0.7354166666666666 | 146.423 |
| 0.7361111111111112 | 146.423 |
| 0.7368055555555556 | 141.884 |
| 0.7374999999999999 | 141.884 |
| 0.7381944444444444 | 141.884 |
| 0.7388888888888889 | 141.884 |
| 0.7395833333333334 | 141.884 |
| 0.7402777777777777 | 141.884 |
| 0.7409722222222223 | 137.347 |
| 0.7416666666666667 | 137.347 |
| 0.7423611111111111 | 137.347 |
| 0.7430555555555555 | 137.347 |
| 0.74375 | 137.347 |
| 0.7444444444444445 | 137.347 |
| 0.7451388888888889 | 132.814 |
| 0.7458333333333332 | 132.814 |
| 0.7465277777777778 | 132.814 |
| 0.7472222222222222 | 132.814 |
| 0.7479166666666667 | 132.814 |
| 0.748611111111111 | 128.284 |
| 0.7493055555555556 | 128.284 |
| 0.75 | 128.284 |
| 0.7506944444444444 | 128.284 |
| 0.751388888888889 | 128.284 |
| 0.7520833333333333 | 128.284 |
| 0.7527777777777778 | 123.758 |
| 0.7534722222222222 | 123.758 |
| 0.7541666666666668 | 123.758 |
| 0.7548611111111111 | 119.235 |
| 0.7555555555555555 | 119.235 |
| 0.75625 | 119.235 |
| 0.7569444444444445 | 119.235 |
| 0.7576388888888889 | 119.235 |
| 0.7583333333333333 | 119.235 |
| 0.7590277777777777 | 119.235 |
| 0.7597222222222223 | 114.716 |
| 0.7604166666666666 | 114.716 |
| 0.7611111111111111 | 114.716 |
| 0.7618055555555556 | 114.716 |
| 0.7625000000000001 | 114.716 |
| 0.7631944444444444 | 110.201 |
| 0.7638888888888888 | 110.201 |
| 0.7645833333333334 | 110.201 |
| 0.7652777777777778 | 110.201 |
| 0.7659722222222222 | 110.201 |
| 0.7666666666666666 | 110.201 |
| 0.7673611111111112 | 105.69 |
| 0.7680555555555556 | 105.69 |
| 0.7687499999999999 | 105.69 |
| 0.7694444444444444 | 105.69 |
| 0.7701388888888889 | 105.69 |
| 0.7708333333333334 | 101.184 |
| 0.7715277777777777 | 101.184 |
| 0.7722222222222223 | 101.184 |
| 0.7729166666666667 | 101.184 |
| 0.7736111111111111 | 101.184 |
| 0.7743055555555555 | 101.184 |
| 0.775 | 101.184 |
| 0.7756944444444445 | 101.184 |
| 0.7763888888888889 | 101.184 |
| 0.7770833333333332 | 96.682 |
| 0.7777777777777778 | 96.682 |
| 0.7784722222222222 | 96.682 |
| 0.7791666666666667 | 96.682 |
| 0.779861111111111 | 96.682 |
| 0.7805555555555556 | 92.184 |
| 0.78125 | 92.184 |
| 0.7819444444444444 | 92.184 |
| 0.782638888888889 | 92.184 |
| 0.7833333333333333 | 92.184 |
| 0.7840277777777778 | 92.184 |
| 0.7847222222222222 | 92.184 |
| 0.7854166666666668 | 87.692 |
| 0.7861111111111111 | 87.692 |
| 0.7868055555555555 | 87.692 |
| 0.7875 | 87.692 |
| 0.7881944444444445 | 87.692 |
| 0.7888888888888889 | 83.205 |
| 0.7895833333333333 | 83.205 |
| 0.7902777777777777 | 83.205 |
| 0.7909722222222223 | 83.205 |
| 0.7916666666666666 | 83.205 |
| 0.7923611111111111 | 83.205 |
| 0.7930555555555556 | 83.205 |
| 0.7937500000000001 | 78.722 |
| 0.7944444444444444 | 78.722 |
| 0.7951388888888888 | 78.722 |
| 0.7958333333333334 | 78.722 |
| 0.7965277777777778 | 74.246 |
| 0.7972222222222222 | 74.246 |
| 0.7979166666666666 | 74.246 |
| 0.7986111111111112 | 74.246 |
| 0.7993055555555556 | 74.246 |
| 0.7999999999999999 | 74.246 |
| 0.8006944444444444 | 74.246 |
| 0.8013888888888889 | 69.775 |
| 0.8020833333333334 | 69.775 |
| 0.8027777777777777 | 69.775 |
| 0.8034722222222223 | 69.775 |
| 0.8041666666666667 | 65.31 |
| 0.8048611111111111 | 65.31 |
| 0.8055555555555555 | 65.31 |
| 0.80625 | 65.31 |
| 0.8069444444444445 | 65.31 |
| 0.8076388888888889 | 65.31 |
| 0.8083333333333332 | 65.31 |
| 0.8090277777777778 | 60.85 |
| 0.8097222222222222 | 60.85 |
| 0.8104166666666667 | 60.85 |
| 0.811111111111111 | 56.398 |
| 0.8118055555555556 | 56.398 |
| 0.8125 | 56.398 |
| 0.8131944444444444 | 56.398 |
| 0.813888888888889 | 56.398 |
| 0.8145833333333333 | 56.398 |
| 0.8152777777777778 | 56.398 |
| 0.8159722222222222 | 51.951 |
| 0.8166666666666668 | 51.951 |
| 0.8173611111111111 | 51.951 |
| 0.8180555555555555 | 47.511 |
| 0.81875 | 47.511 |
| 0.8194444444444445 | 47.511 |
| 0.8201388888888889 | 47.511 |
| 0.8208333333333333 | 47.511 |
| 0.8215277777777777 | 47.511 |
| 0.8222222222222223 | 43.079 |
| 0.8229166666666666 | 43.079 |
| 0.8236111111111111 | 43.079 |
| 0.8243055555555556 | 43.079 |
| 0.8250000000000001 | 38.653 |
| 0.8256944444444444 | 38.653 |
| 0.8263888888888888 | 38.653 |
| 0.8270833333333334 | 38.653 |
| 0.8277777777777778 | 34.234 |
| 0.8284722222222222 | 34.234 |
| 0.8291666666666666 | 34.234 |
| 0.8298611111111112 | 34.234 |
| 0.8305555555555556 | 29.823 |
| 0.8312499999999999 | 29.823 |
| 0.8319444444444444 | 29.823 |
| 0.8326388888888889 | 29.823 |
| 0.8333333333333334 | 25.419 |
| 0.8340277777777777 | 25.419 |
| 0.8347222222222223 | 25.419 |
| 0.8354166666666667 | 21.024 |
| 0.8361111111111111 | 21.024 |
| 0.8368055555555555 | 21.024 |
| 0.8375 | 21.024 |
| 0.8381944444444445 | 21.024 |
| 0.8388888888888889 | 16.636 |
| 0.8395833333333332 | 16.636 |
| 0.8402777777777778 | 16.636 |
| 0.8409722222222222 | 16.636 |
| 0.8416666666666667 | 16.636 |
| 0.842361111111111 | 12.257 |
| 0.8430555555555556 | 12.257 |
| 0.84375 | 12.257 |
| 0.8444444444444444 | 12.257 |
| 0.845138888888889 | 7.887 |
| 0.8458333333333333 | 7.887 |
| 0.8465277777777778 | 7.887 |
| 0.8472222222222222 | 7.887 |
| 0.8479166666666668 | 7.887 |
| 0.8486111111111111 | 3.525 |
| 0.8493055555555555 | 3.525 |
| 0.85 | 3.525 |
| 0.8506944444444445 | 3.525 |
| 0.8513888888888889 | 3.525 |
| 0.8520833333333333 | 3.525 |
| 0.8527777777777777 | 3.525 |
| 0.8534722222222223 | 3.525 |
| 0.8541666666666666 | 0 |
| 0.8548611111111111 | 0 |
| 0.8555555555555556 | 0 |
| 0.8562500000000001 | 0 |
| 0.8569444444444444 | 0 |
| 0.8576388888888888 | 0 |
| 0.8583333333333334 | 0 |
| 0.8590277777777778 | 0 |
| 0.8597222222222222 | 0 |
| 0.8604166666666666 | 0 |
| 0.8611111111111112 | 0 |
| 0.8618055555555556 | 0 |
| 0.8624999999999999 | 0 |
| 0.8631944444444444 | 0 |
| 0.8638888888888889 | 0 |
| 0.8645833333333334 | 0 |
| 0.8652777777777777 | 0 |
| 0.8659722222222223 | 0 |
| 0.8666666666666667 | 0 |
| 0.8673611111111111 | 0 |
| 0.8680555555555555 | 0 |
| 0.86875 | 0 |
| 0.8694444444444445 | 0 |
| 0.8701388888888889 | 0 |
| 0.8708333333333332 | 0 |
| 0.8715277777777778 | 0 |
| 0.8722222222222222 | 0 |
| 0.8729166666666667 | 0 |
| 0.873611111111111 | 0 |
| 0.8743055555555556 | 0 |
| 0.875 | 0 |
| 0.8756944444444444 | 0 |
| 0.876388888888889 | 0 |
| 0.8770833333333333 | 0 |
| 0.8777777777777778 | 0 |
| 0.8784722222222222 | 0 |
| 0.8791666666666668 | 0 |
| 0.8798611111111111 | 0 |
| 0.8805555555555555 | 0 |
| 0.88125 | 0 |
| 0.8819444444444445 | 0 |
| 0.8826388888888889 | 0 |
| 0.8833333333333333 | 0 |
| 0.8840277777777777 | 0 |
| 0.8847222222222223 | 0 |
| 0.8854166666666666 | 0 |
| 0.8861111111111111 | 0 |
| 0.8868055555555556 | 0 |
| 0.8875000000000001 | 0 |
| 0.8881944444444444 | 0 |
| 0.8888888888888888 | 0 |
| 0.8895833333333334 | 0 |
| 0.8902777777777778 | 0 |
| 0.8909722222222222 | 0 |
| 0.8916666666666666 | 0 |
| 0.8923611111111112 | 0 |
| 0.8930555555555556 | 0 |
| 0.8937499999999999 | 0 |
| 0.8944444444444444 | 0 |
| 0.8951388888888889 | 0 |
| 0.8958333333333334 | 0 |
| 0.8965277777777777 | 0 |
| 0.8972222222222223 | 0 |
| 0.8979166666666667 | 0 |
| 0.8986111111111111 | 0 |
| 0.8993055555555555 | 0 |
| 0.9 | 0 |
| 0.9006944444444445 | 0 |
| 0.9013888888888889 | 0 |
| 0.9020833333333332 | 0 |
| 0.9027777777777778 | 0 |
| 0.9034722222222222 | 0 |
| 0.9041666666666667 | 0 |
| 0.904861111111111 | 0 |
| 0.9055555555555556 | 0 |
| 0.90625 | 0 |
| 0.9069444444444444 | 0 |
| 0.907638888888889 | 0 |
| 0.9083333333333333 | 0 |
| 0.9090277777777778 | 0 |
| 0.9097222222222222 | 0 |
| 0.9104166666666668 | 0 |
| 0.9111111111111111 | 0 |
| 0.9118055555555555 | 0 |
| 0.9125 | 0 |
| 0.9131944444444445 | 0 |
| 0.9138888888888889 | 0 |
| 0.9145833333333333 | 0 |
| 0.9152777777777777 | 0 |
| 0.9159722222222223 | 0 |
| 0.9166666666666666 | 0 |
| 0.9173611111111111 | 0 |
| 0.9180555555555556 | 0 |
| 0.9187500000000001 | 0 |
| 0.9194444444444444 | 0 |
| 0.9201388888888888 | 0 |
| 0.9208333333333334 | 0 |
| 0.9215277777777778 | 0 |
| 0.9222222222222222 | 0 |
| 0.9229166666666666 | 0 |
| 0.9236111111111112 | 0 |
| 0.9243055555555556 | 0 |
| 0.9249999999999999 | 0 |
| 0.9256944444444444 | 0 |
| 0.9263888888888889 | 0 |
| 0.9270833333333334 | 0 |
| 0.9277777777777777 | 0 |
| 0.9284722222222223 | 0 |
| 0.9291666666666667 | 0 |
| 0.9298611111111111 | 0 |
| 0.9305555555555555 | 0 |
| 0.93125 | 0 |
| 0.9319444444444445 | 0 |
| 0.9326388888888889 | 0 |
| 0.9333333333333332 | 0 |
| 0.9340277777777778 | 0 |
| 0.9347222222222222 | 0 |
| 0.9354166666666667 | 0 |
| 0.936111111111111 | 0 |
| 0.9368055555555556 | 0 |
| 0.9375 | 0 |
| 0.9381944444444444 | 0 |
| 0.938888888888889 | 0 |
| 0.9395833333333333 | 0 |
| 0.9402777777777778 | 0 |
| 0.9409722222222222 | 0 |
| 0.9416666666666668 | 0 |
| 0.9423611111111111 | 0 |
| 0.9430555555555555 | 0 |
| 0.94375 | 0 |
| 0.9444444444444445 | 0 |
| 0.9451388888888889 | 0 |
| 0.9458333333333333 | 0 |
| 0.9465277777777777 | 0 |
| 0.9472222222222223 | 0 |
| 0.9479166666666666 | 0 |
| 0.9486111111111111 | 0 |
| 0.9493055555555556 | 0 |
| 0.9500000000000001 | 0 |
| 0.9506944444444444 | 0 |
| 0.9513888888888888 | 0 |
| 0.9520833333333334 | 0 |
| 0.9527777777777778 | 0 |
| 0.9534722222222222 | 0 |
| 0.9541666666666666 | 0 |
| 0.9548611111111112 | 0 |
| 0.9555555555555556 | 0 |
| 0.9562499999999999 | 0 |
| 0.9569444444444444 | 0 |
| 0.9576388888888889 | 0 |
| 0.9583333333333334 | 0 |
| 0.9590277777777777 | 0 |
| 0.9597222222222223 | 0 |
| 0.9604166666666667 | 0 |
| 0.9611111111111111 | 0 |
| 0.9618055555555555 | 0 |
| 0.9625 | 0 |
| 0.9631944444444445 | 0 |
| 0.9638888888888889 | 0 |
| 0.9645833333333332 | 0 |
| 0.9652777777777778 | 0 |
| 0.9659722222222222 | 0 |
| 0.9666666666666667 | 0 |
| 0.967361111111111 | 0 |
| 0.9680555555555556 | 0 |
| 0.96875 | 0 |
| 0.9694444444444444 | 0 |
| 0.970138888888889 | 0 |
| 0.9708333333333333 | 0 |
| 0.9715277777777778 | 0 |
| 0.9722222222222222 | 0 |
| 0.9729166666666668 | 0 |
| 0.9736111111111111 | 0 |
| 0.9743055555555555 | 0 |
| 0.975 | 0 |
| 0.9756944444444445 | 0 |
| 0.9763888888888889 | 0 |
| 0.9770833333333333 | 0 |
| 0.9777777777777777 | 0 |
| 0.9784722222222223 | 0 |
| 0.9791666666666666 | 0 |
| 0.9798611111111111 | 0 |
| 0.9805555555555556 | 0 |
| 0.9812500000000001 | 0 |
| 0.9819444444444444 | 0 |
| 0.9826388888888888 | 0 |
| 0.9833333333333334 | 0 |
| 0.9840277777777778 | 0 |
| 0.9847222222222222 | 0 |
| 0.9854166666666666 | 0 |
| 0.9861111111111112 | 0 |
| 0.9868055555555556 | 0 |
| 0.9874999999999999 | 0 |
| 0.9881944444444444 | 0 |
| 0.9888888888888889 | 0 |
| 0.9895833333333334 | 0 |
| 0.9902777777777777 | 0 |
| 0.9909722222222223 | 0 |
| 0.9916666666666667 | 0 |
| 0.9923611111111111 | 0 |
| 0.9930555555555555 | 0 |
| 0.99375 | 0 |
| 0.9944444444444445 | 0 |
| 0.9951388888888889 | 0 |
| 0.9958333333333332 | 0 |
| 0.9965277777777778 | 0 |
| 0.9972222222222222 | 0 |
| 0.9979166666666667 | 0 |
| 0.998611111111111 | 0 |
| 0.9993055555555556 | 0 |